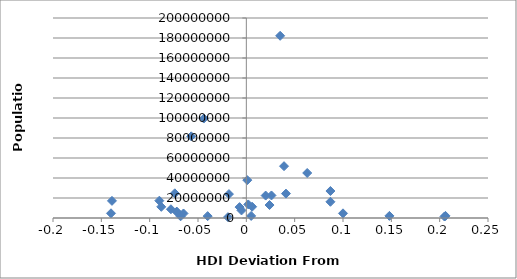
| Category | Series 0 |
|---|---|
| -0.056999999999999995 | 81680000 |
| 0.09999999999999998 | 4662446 |
| 0.041000000000000036 | 24383301 |
| 0.08699999999999997 | 16212000 |
| 0.039000000000000035 | 51820000 |
| 0.06300000000000006 | 45010056 |
| 0.0010000000000000009 | 37873253 |
| 0.006000000000000005 | 11262564 |
| -0.08799999999999997 | 11178921 |
| -0.07400000000000001 | 24692144 |
| 0.02400000000000002 | 12973808 |
| 0.20599999999999996 | 2155784 |
| 0.14800000000000002 | 2113077 |
| 0.0050000000000000044 | 2067000 |
| -0.14 | 4709000 |
| 0.20499999999999996 | 1475000 |
| 0.026000000000000023 | 22534532 |
| 0.03500000000000003 | 182202000 |
| -0.007000000000000006 | 10879829 |
| -0.0050000000000000044 | 7552318 |
| 0.08699999999999997 | 27000000 |
| -0.018000000000000016 | 23919000 |
| -0.065 | 4503000 |
| -0.07200000000000001 | 6190280 |
| -0.07800000000000001 | 8746128 |
| -0.068 | 1693398 |
| 0.0020000000000000018 | 13567338 |
| -0.03999999999999998 | 1882450 |
| -0.08999999999999997 | 17322796 |
| -0.139 | 17138707 |
| -0.043999999999999984 | 99465819 |
| -0.019000000000000017 | 828324 |
| -0.07200000000000001 | 6380803 |
| 0.020000000000000018 | 22434363 |